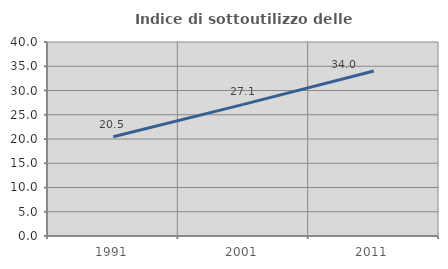
| Category | Indice di sottoutilizzo delle abitazioni  |
|---|---|
| 1991.0 | 20.466 |
| 2001.0 | 27.141 |
| 2011.0 | 34.018 |